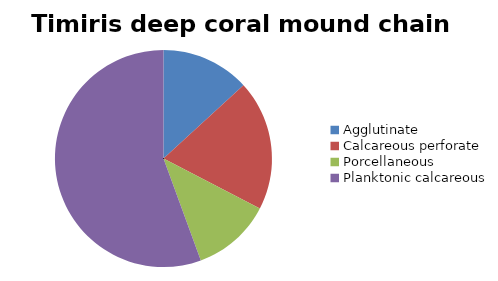
| Category | Timiris deep coral mound chain |
|---|---|
| ﻿Agglutinate | 13.185 |
| Calcareous perforate | 19.422 |
| Porcellaneous | 11.805 |
| Planktonic calcareous | 55.588 |